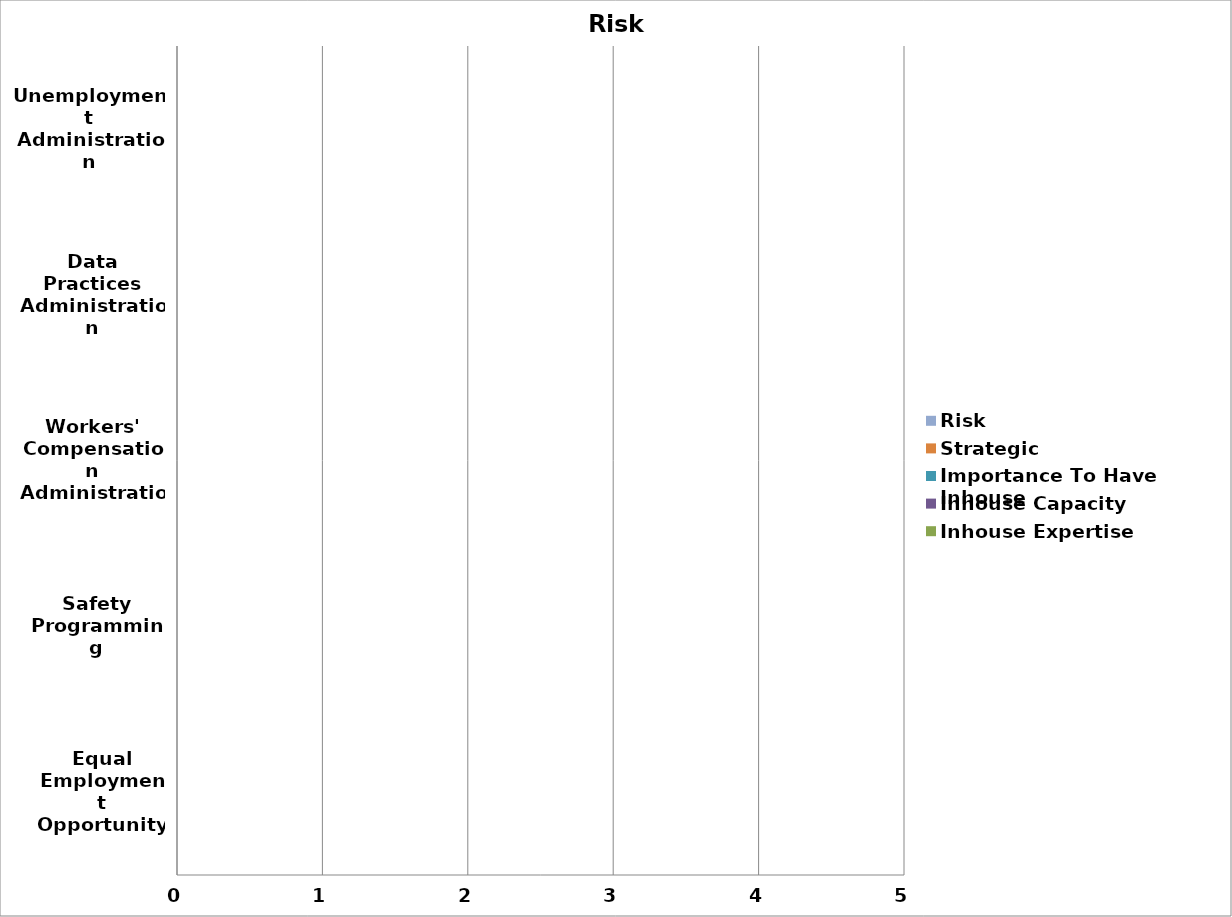
| Category | Inhouse Expertise | Inhouse Capacity | Importance To Have Inhouse | Strategic | Risk |
|---|---|---|---|---|---|
| Equal Employment Opportunity Compliance | 0 | 0 | 0 | 0 | 0 |
| Safety Programming | 0 | 0 | 0 | 0 | 0 |
| Workers' Compensation Administration | 0 | 0 | 0 | 0 | 0 |
| Data Practices Administration | 0 | 0 | 0 | 0 | 0 |
| Unemployment Administration | 0 | 0 | 0 | 0 | 0 |